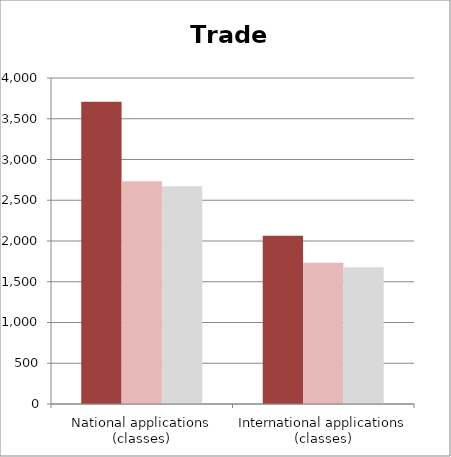
| Category | Series 0 | Last month  | Previous month |
|---|---|---|---|
| National applications (classes) | 3708 | 2733 | 2671 |
| International applications (classes) | 2065 | 1734 | 1679 |